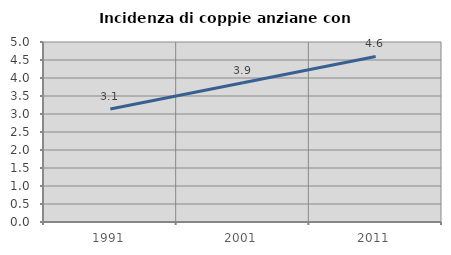
| Category | Incidenza di coppie anziane con figli |
|---|---|
| 1991.0 | 3.138 |
| 2001.0 | 3.87 |
| 2011.0 | 4.598 |